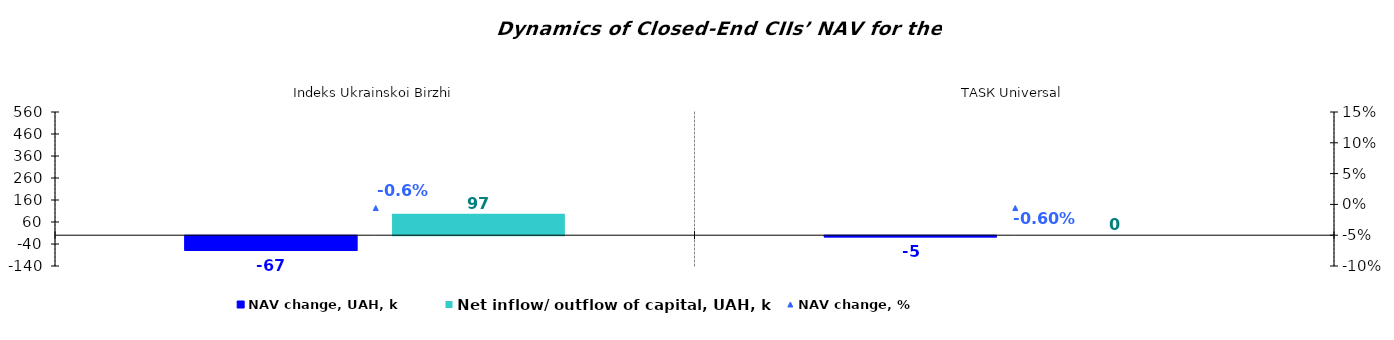
| Category | NAV change, UAH, k | Net inflow/ outflow of capital, UAH, k |
|---|---|---|
| Іndeks Ukrainskoi Birzhi | -66.748 | 97.25 |
| ТАSК Universal | -5.367 | 0 |